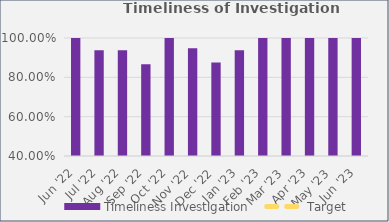
| Category | Timeliness Investigation |
|---|---|
| Jun '22 | 1 |
| Jul '22 | 0.938 |
| Aug '22 | 0.938 |
| Sep '22 | 0.867 |
| Oct '22 | 1 |
| Nov '22 | 0.947 |
| Dec '22 | 0.875 |
| Jan '23 | 0.938 |
| Feb '23 | 1 |
| Mar '23 | 1 |
| Apr '23 | 1 |
| May '23 | 1 |
| Jun '23 | 1 |